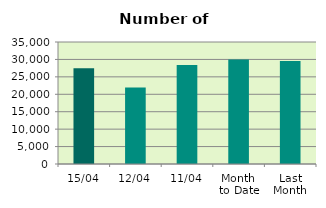
| Category | Series 0 |
|---|---|
| 15/04 | 27470 |
| 12/04 | 21936 |
| 11/04 | 28426 |
| Month 
to Date | 29948.364 |
| Last
Month | 29553.143 |